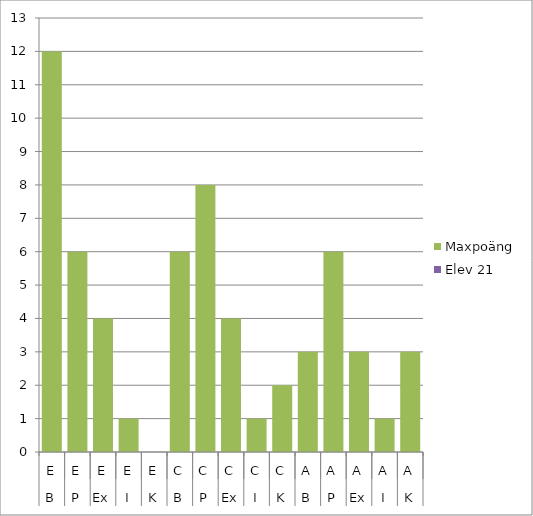
| Category | Maxpoäng | Elev 21 |
|---|---|---|
| 0 | 12 | 0 |
| 1 | 6 | 0 |
| 2 | 4 | 0 |
| 3 | 1 | 0 |
| 4 | 0 | 0 |
| 5 | 6 | 0 |
| 6 | 8 | 0 |
| 7 | 4 | 0 |
| 8 | 1 | 0 |
| 9 | 2 | 0 |
| 10 | 3 | 0 |
| 11 | 6 | 0 |
| 12 | 3 | 0 |
| 13 | 1 | 0 |
| 14 | 3 | 0 |